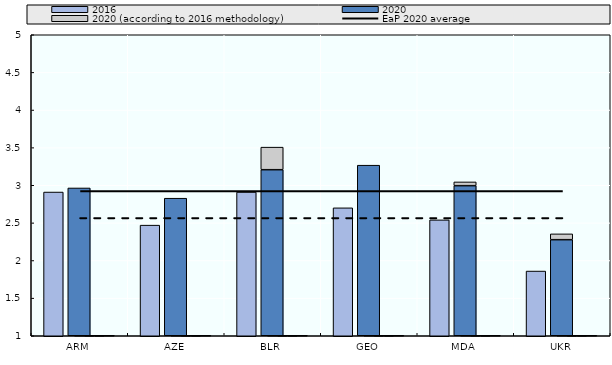
| Category | 2020 | Difference with 2020 according to 2016 methodology |
|---|---|---|
| ARM | 2.964 | 0 |
| AZE | 2.828 | 0 |
| BLR | 3.207 | 0.3 |
| GEO | 3.267 | 0 |
| MDA | 2.994 | 0.05 |
| UKR | 2.277 | 0.077 |